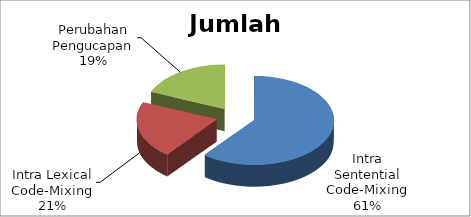
| Category | Jumlah |
|---|---|
| Intra Sentential Code-Mixing | 94 |
| Intra Lexical Code-Mixing | 32 |
| Perubahan Pengucapan | 29 |